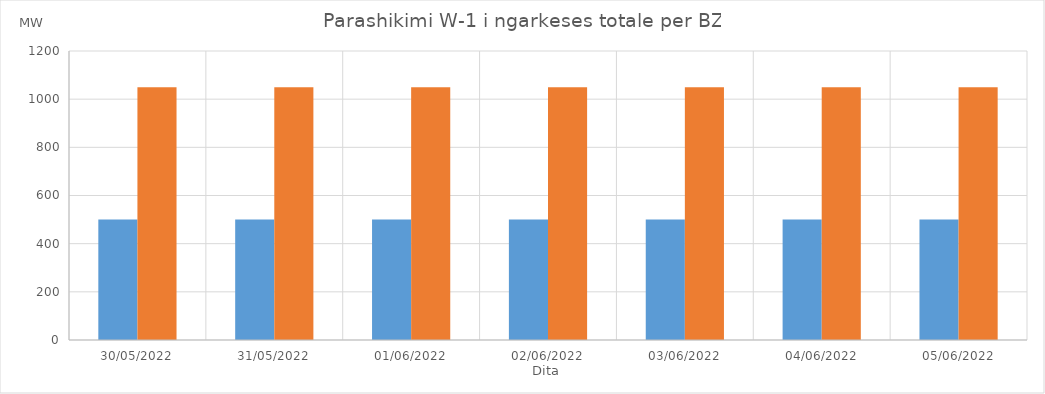
| Category | Min (MW) | Max (MW) |
|---|---|---|
| 30/05/2022 | 500 | 1050 |
| 31/05/2022 | 500 | 1050 |
| 01/06/2022 | 500 | 1050 |
| 02/06/2022 | 500 | 1050 |
| 03/06/2022 | 500 | 1050 |
| 04/06/2022 | 500 | 1050 |
| 05/06/2022 | 500 | 1050 |